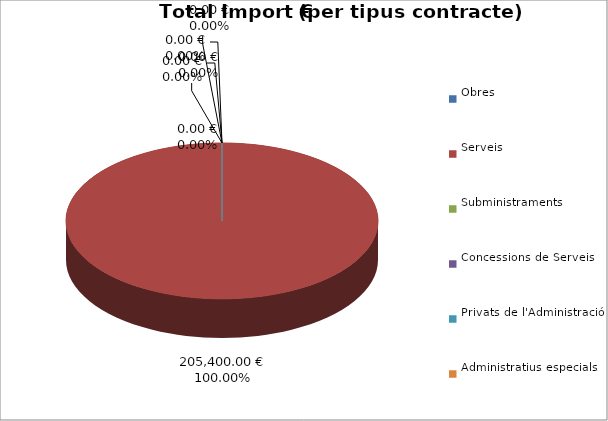
| Category | Total preu
(amb IVA) |
|---|---|
| Obres | 0 |
| Serveis | 205400 |
| Subministraments | 0 |
| Concessions de Serveis | 0 |
| Privats de l'Administració | 0 |
| Administratius especials | 0 |